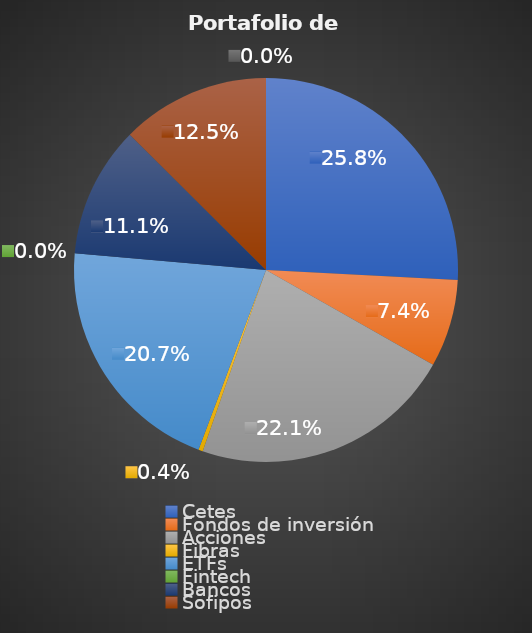
| Category | Series 0 |
|---|---|
| Cetes | 0.258 |
| Fondos de inversión | 0.074 |
| Acciones | 0.221 |
| Fibras | 0.004 |
| ETFs  | 0.207 |
| Fintech | 0 |
| Bancos | 0.111 |
| Sofipos | 0.125 |
| Otras inversiones | 0 |